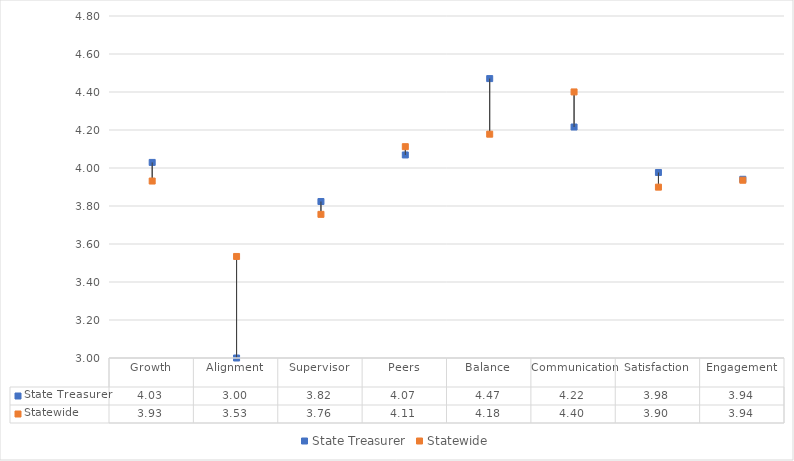
| Category | State Treasurer | Statewide |
|---|---|---|
| Growth | 4.029 | 3.931 |
| Alignment | 3 | 3.534 |
| Supervisor | 3.824 | 3.756 |
| Peers | 4.069 | 4.112 |
| Balance | 4.471 | 4.178 |
| Communication | 4.216 | 4.4 |
| Satisfaction | 3.976 | 3.899 |
| Engagement | 3.941 | 3.936 |